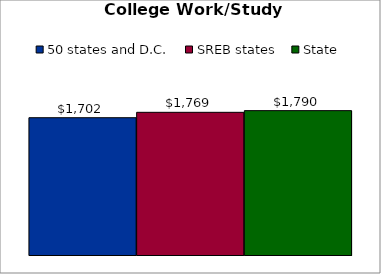
| Category | 50 states and D.C. | SREB states | State |
|---|---|---|---|
| 0 | 1701.839 | 1768.763 | 1789.748 |